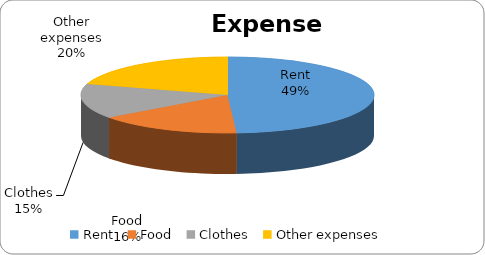
| Category | Total |
|---|---|
| Rent | 2000 |
| Food | 650 |
| Clothes | 600 |
| Other expenses | 830 |